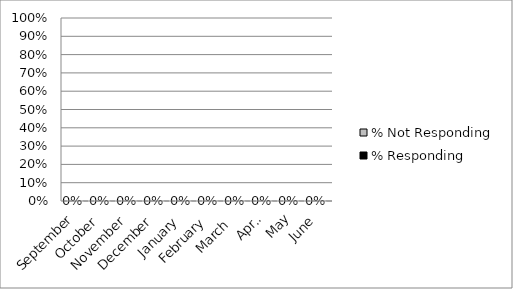
| Category | % Responding | % Not Responding |
|---|---|---|
| September | 0 | 0 |
| October | 0 | 0 |
| November | 0 | 0 |
| December | 0 | 0 |
| January | 0 | 0 |
| February | 0 | 0 |
| March  | 0 | 0 |
| April | 0 | 0 |
| May | 0 | 0 |
| June | 0 | 0 |